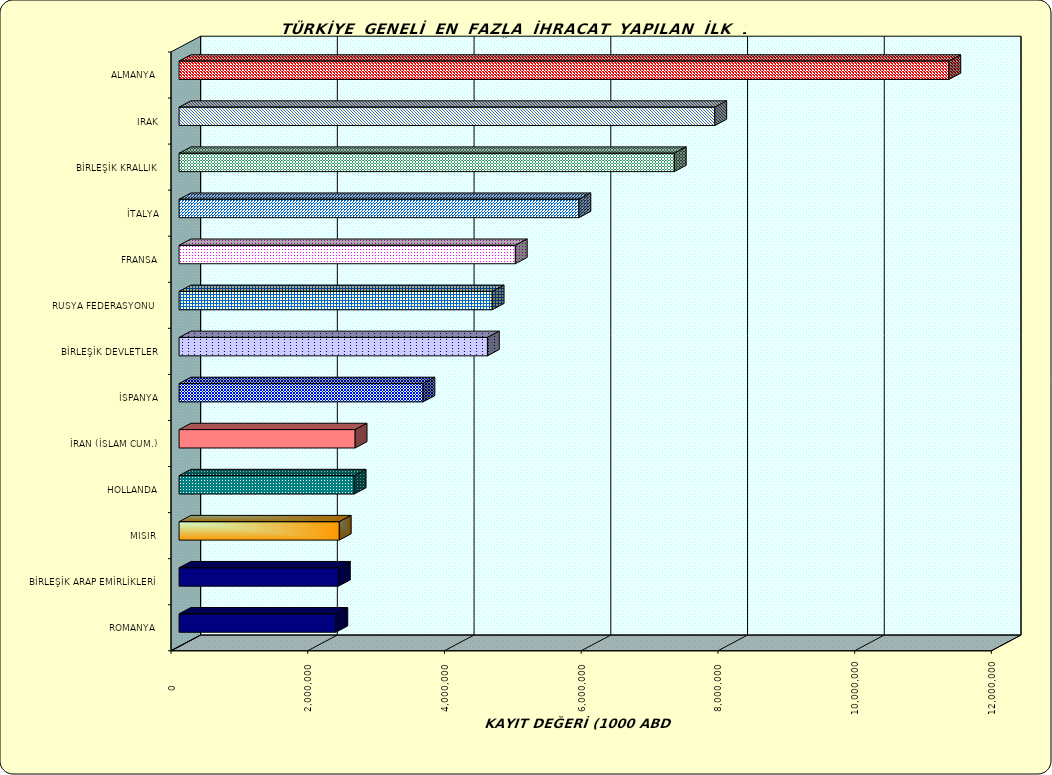
| Category | Series 0 |
|---|---|
| ALMANYA  | 11260080.62 |
| IRAK | 7836448.478 |
| BİRLEŞİK KRALLIK | 7244466.98 |
| İTALYA | 5849108.397 |
| FRANSA | 4918635.53 |
| RUSYA FEDERASYONU  | 4580184.282 |
| BİRLEŞİK DEVLETLER | 4510485.37 |
| İSPANYA | 3568027.684 |
| İRAN (İSLAM CUM.) | 2575869.484 |
| HOLLANDA | 2561702.09 |
| MISIR  | 2343749.568 |
| BİRLEŞİK ARAP EMİRLİKLERİ | 2331181.038 |
| ROMANYA  | 2293842.907 |